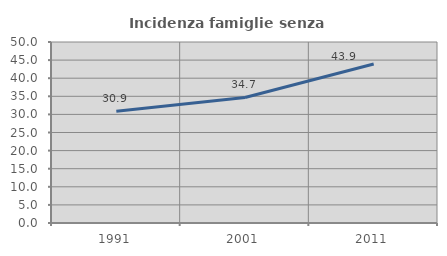
| Category | Incidenza famiglie senza nuclei |
|---|---|
| 1991.0 | 30.893 |
| 2001.0 | 34.674 |
| 2011.0 | 43.923 |